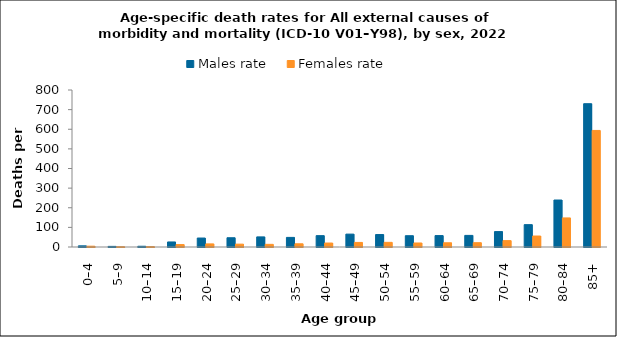
| Category | Males rate | Females rate |
|---|---|---|
| 0–4 | 5.918 | 4.077 |
| 5–9 | 3.134 | 1.533 |
| 10–14 | 3.8 | 2.134 |
| 15–19 | 25.669 | 12.381 |
| 20–24 | 45.63 | 15.788 |
| 25–29 | 47.158 | 14.514 |
| 30–34 | 51.498 | 13.533 |
| 35–39 | 48.918 | 16.35 |
| 40–44 | 57.855 | 20.161 |
| 45–49 | 65.622 | 23.31 |
| 50–54 | 63.521 | 23.697 |
| 55–59 | 57.52 | 20.505 |
| 60–64 | 58.165 | 21.515 |
| 65–69 | 59.141 | 21.906 |
| 70–74 | 78.561 | 32.506 |
| 75–79 | 113.932 | 55.926 |
| 80–84 | 239.352 | 148.106 |
| 85+ | 730.242 | 593.918 |